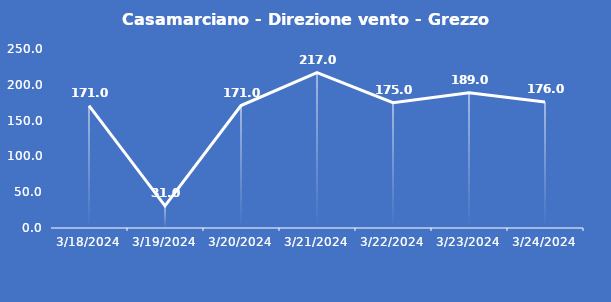
| Category | Casamarciano - Direzione vento - Grezzo (°N) |
|---|---|
| 3/18/24 | 171 |
| 3/19/24 | 31 |
| 3/20/24 | 171 |
| 3/21/24 | 217 |
| 3/22/24 | 175 |
| 3/23/24 | 189 |
| 3/24/24 | 176 |